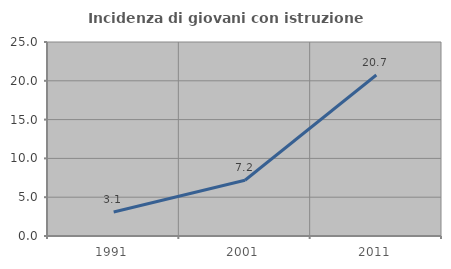
| Category | Incidenza di giovani con istruzione universitaria |
|---|---|
| 1991.0 | 3.099 |
| 2001.0 | 7.19 |
| 2011.0 | 20.744 |